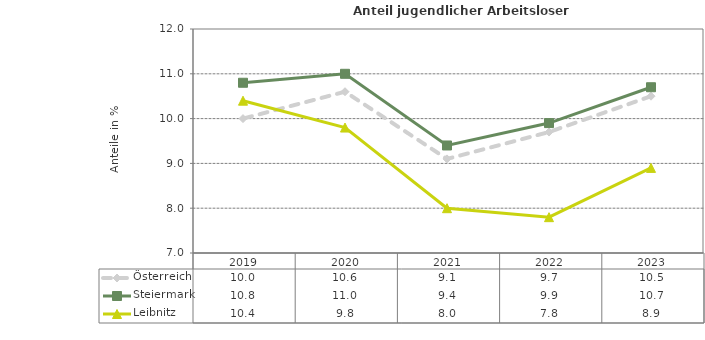
| Category | Österreich | Steiermark | Leibnitz |
|---|---|---|---|
| 2023.0 | 10.5 | 10.7 | 8.9 |
| 2022.0 | 9.7 | 9.9 | 7.8 |
| 2021.0 | 9.1 | 9.4 | 8 |
| 2020.0 | 10.6 | 11 | 9.8 |
| 2019.0 | 10 | 10.8 | 10.4 |